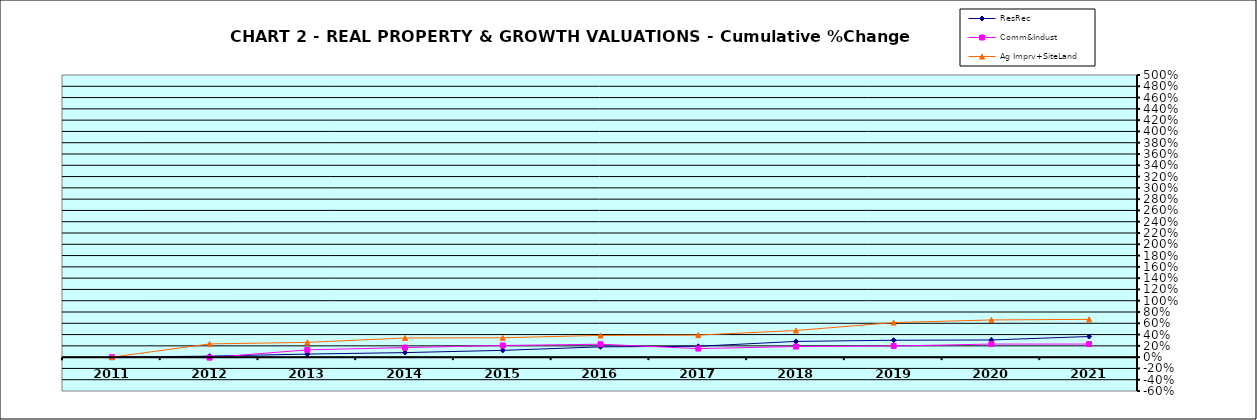
| Category | ResRec | Comm&Indust | Ag Imprv+SiteLand |
|---|---|---|---|
| 2011.0 | 0 | 0 | 0 |
| 2012.0 | 0.018 | -0.009 | 0.234 |
| 2013.0 | 0.054 | 0.129 | 0.261 |
| 2014.0 | 0.08 | 0.169 | 0.339 |
| 2015.0 | 0.12 | 0.207 | 0.344 |
| 2016.0 | 0.182 | 0.229 | 0.385 |
| 2017.0 | 0.193 | 0.152 | 0.391 |
| 2018.0 | 0.279 | 0.187 | 0.472 |
| 2019.0 | 0.3 | 0.197 | 0.613 |
| 2020.0 | 0.304 | 0.232 | 0.659 |
| 2021.0 | 0.366 | 0.232 | 0.67 |